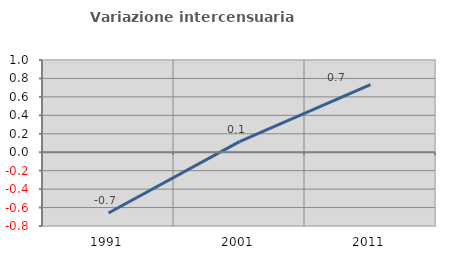
| Category | Variazione intercensuaria annua |
|---|---|
| 1991.0 | -0.659 |
| 2001.0 | 0.115 |
| 2011.0 | 0.732 |